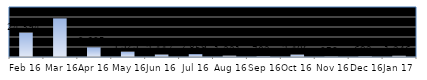
| Category | Series 0 |
|---|---|
| Feb 16 | 24394 |
| Mar 16 | 38623 |
| Apr 16 | 9635 |
| May 16 | 5323 |
| Jun 16 | 2447 |
| Jul 16 | 2859 |
| Aug 16 | 1331 |
| Sep 16 | 702 |
| Oct 16 | 2406 |
| Nov 16 | 378 |
| Dec 16 | 692 |
| Jan 17 | 1246 |